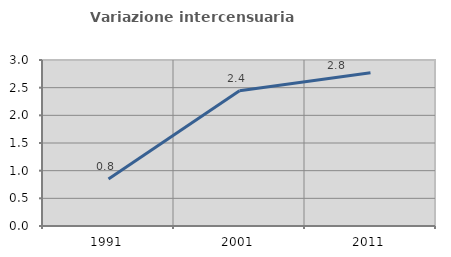
| Category | Variazione intercensuaria annua |
|---|---|
| 1991.0 | 0.848 |
| 2001.0 | 2.444 |
| 2011.0 | 2.771 |